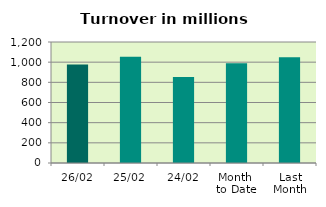
| Category | Series 0 |
|---|---|
| 26/02 | 976.373 |
| 25/02 | 1052.944 |
| 24/02 | 853.02 |
| Month 
to Date | 989.924 |
| Last
Month | 1049.647 |